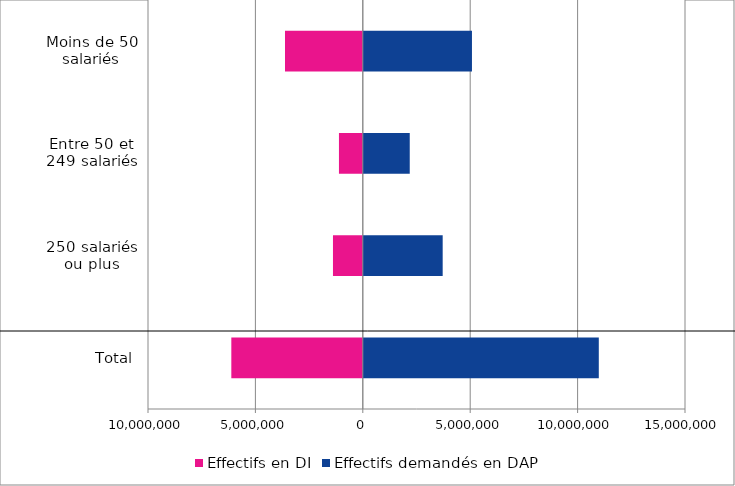
| Category | Effectifs en DI | Effectifs demandés en DAP |
|---|---|---|
| Total | -6120875 | 10986849 |
| 250 salariés ou plus | -1388724 | 3718969 |
| Entre 50 et 249 salariés | -1110064 | 2185726 |
| Moins de 50 salariés | -3622087 | 5082154 |